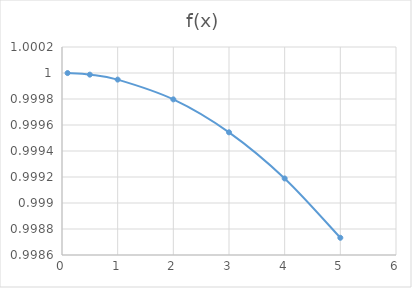
| Category | f(x) |
|---|---|
| 5.0 | 0.999 |
| 4.0 | 0.999 |
| 3.0 | 1 |
| 2.0 | 1 |
| 1.0 | 1 |
| 0.5 | 1 |
| 0.1 | 1 |